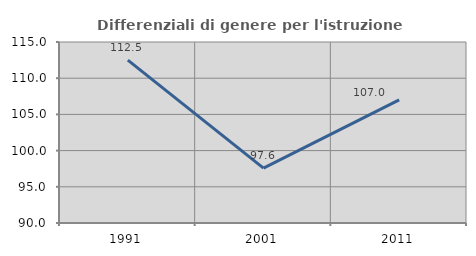
| Category | Differenziali di genere per l'istruzione superiore |
|---|---|
| 1991.0 | 112.488 |
| 2001.0 | 97.576 |
| 2011.0 | 106.997 |